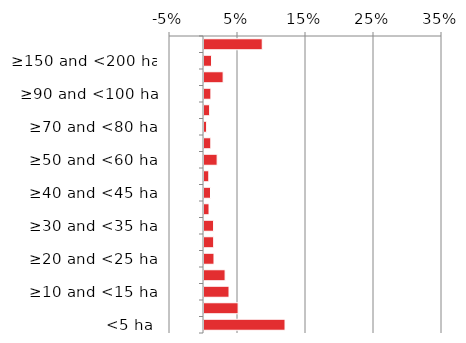
| Category | Native |
|---|---|
| <5 ha | 0.119 |
| ≥5 and <10 ha | 0.05 |
| ≥10 and <15 ha | 0.037 |
| ≥15 and <20 ha | 0.031 |
| ≥20 and <25 ha | 0.015 |
| ≥25 and <30 ha | 0.014 |
| ≥30 and <35 ha | 0.014 |
| ≥35 and <40 ha | 0.007 |
| ≥40 and <45 ha | 0.01 |
| ≥45 and <50 ha | 0.007 |
| ≥50 and <60 ha | 0.019 |
| ≥60 and <70 ha | 0.01 |
| ≥70 and <80 ha | 0.004 |
| ≥80 and <90 ha | 0.008 |
| ≥90 and <100 ha | 0.01 |
| ≥100 and <150 ha | 0.028 |
| ≥150 and <200 ha | 0.011 |
| ≥200 ha | 0.086 |